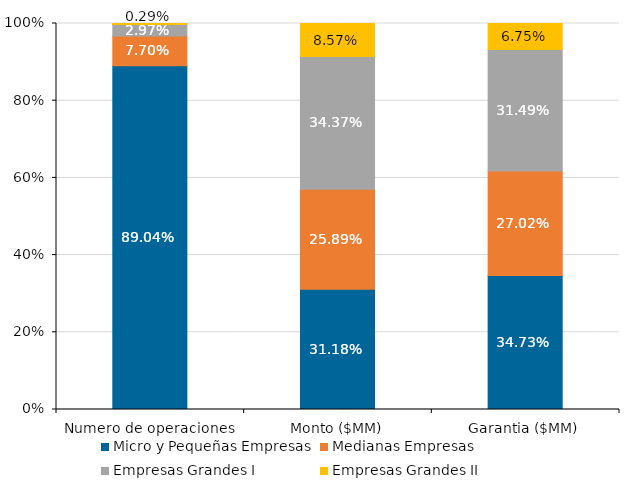
| Category | Micro y Pequeñas Empresas | Medianas Empresas | Empresas Grandes I | Empresas Grandes II |
|---|---|---|---|---|
| Numero de operaciones | 0.89 | 0.077 | 0.03 | 0.003 |
| Monto ($MM) | 0.312 | 0.259 | 0.344 | 0.086 |
| Garantia ($MM) | 0.347 | 0.27 | 0.315 | 0.068 |